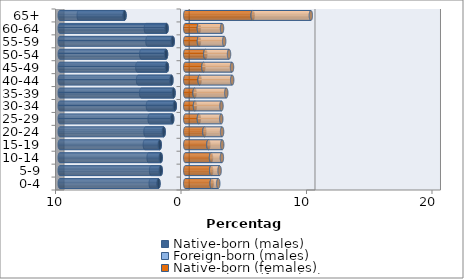
| Category | Native-born (males) | Foreign-born (males) | Native-born (females) | Foreign-born (females) |
|---|---|---|---|---|
| 0-4 | -2.134 | -0.617 | 2.107 | 0.523 |
| 5-9 | -1.953 | -0.767 | 2.068 | 0.667 |
| 10-14 | -1.956 | -0.963 | 2.054 | 0.865 |
| 15-19 | -2.034 | -1.184 | 1.843 | 1.103 |
| 20-24 | -1.719 | -1.45 | 1.524 | 1.411 |
| 25-29 | -1.041 | -1.797 | 1.086 | 1.784 |
| 30-34 | -0.834 | -2.141 | 0.773 | 2.113 |
| 35-39 | -0.93 | -2.578 | 0.744 | 2.525 |
| 40-44 | -1.104 | -2.656 | 1.146 | 2.594 |
| 45-49 | -1.461 | -2.358 | 1.446 | 2.28 |
| 50-54 | -1.531 | -1.972 | 1.597 | 1.892 |
| 55-59 | -0.998 | -2.012 | 1.091 | 2.01 |
| 60-64 | -1.489 | -1.648 | 1.086 | 1.844 |
| 65+ | -4.841 | -3.647 | 5.376 | 4.632 |